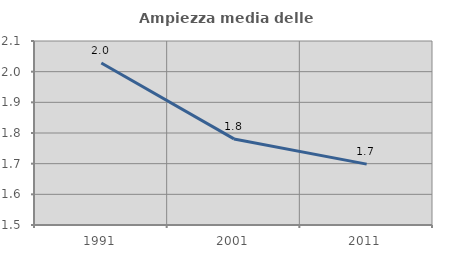
| Category | Ampiezza media delle famiglie |
|---|---|
| 1991.0 | 2.028 |
| 2001.0 | 1.781 |
| 2011.0 | 1.699 |